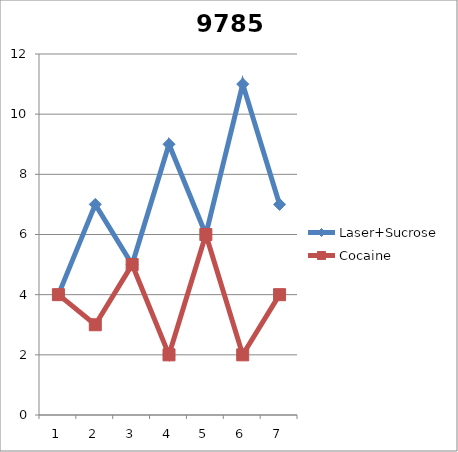
| Category | Laser+Sucrose | Cocaine |
|---|---|---|
| 0 | 4 | 4 |
| 1 | 7 | 3 |
| 2 | 5 | 5 |
| 3 | 9 | 2 |
| 4 | 6 | 6 |
| 5 | 11 | 2 |
| 6 | 7 | 4 |